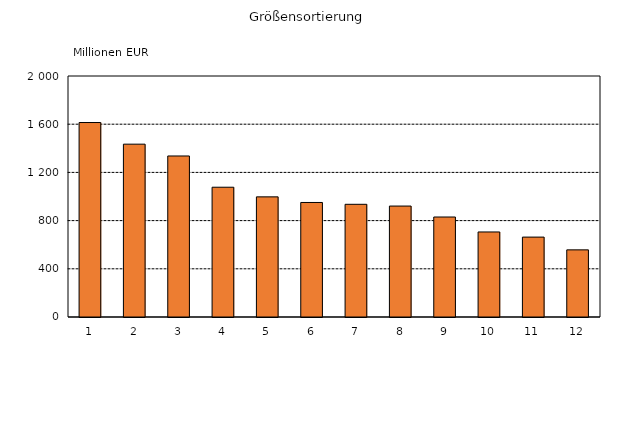
| Category | Series 0 |
|---|---|
| 1 | 1613.852 |
| 2 | 1434.304 |
| 3 | 1336.3 |
| 4 | 1076.963 |
| 5 | 996.979 |
| 6 | 950.406 |
| 7 | 935.259 |
| 8 | 920.739 |
| 9 | 829.828 |
| 10 | 705.715 |
| 11 | 663.064 |
| 12 | 557.16 |